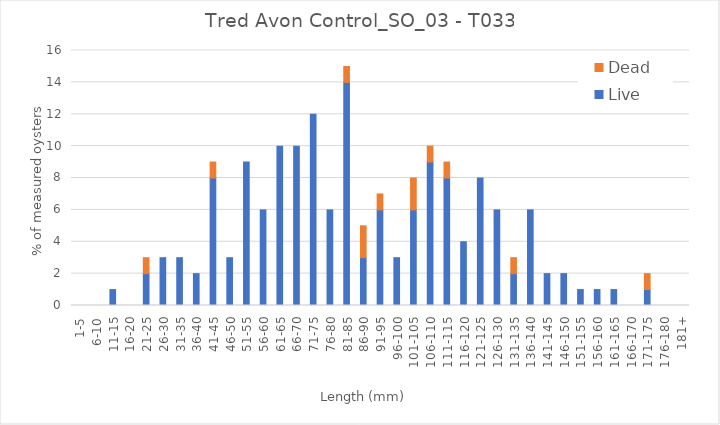
| Category | Live | Dead |
|---|---|---|
| 1-5 | 0 | 0 |
| 6-10 | 0 | 0 |
| 11-15 | 1 | 0 |
| 16-20 | 0 | 0 |
| 21-25 | 2 | 1 |
| 26-30 | 3 | 0 |
| 31-35 | 3 | 0 |
| 36-40 | 2 | 0 |
| 41-45 | 8 | 1 |
| 46-50 | 3 | 0 |
| 51-55 | 9 | 0 |
| 56-60 | 6 | 0 |
| 61-65 | 10 | 0 |
| 66-70 | 10 | 0 |
| 71-75 | 12 | 0 |
| 76-80 | 6 | 0 |
| 81-85 | 14 | 1 |
| 86-90 | 3 | 2 |
| 91-95 | 6 | 1 |
| 96-100 | 3 | 0 |
| 101-105 | 6 | 2 |
| 106-110 | 9 | 1 |
| 111-115 | 8 | 1 |
| 116-120 | 4 | 0 |
| 121-125 | 8 | 0 |
| 126-130 | 6 | 0 |
| 131-135 | 2 | 1 |
| 136-140 | 6 | 0 |
| 141-145 | 2 | 0 |
| 146-150 | 2 | 0 |
| 151-155 | 1 | 0 |
| 156-160 | 1 | 0 |
| 161-165 | 1 | 0 |
| 166-170 | 0 | 0 |
| 171-175 | 1 | 1 |
| 176-180 | 0 | 0 |
| 181+ | 0 | 0 |